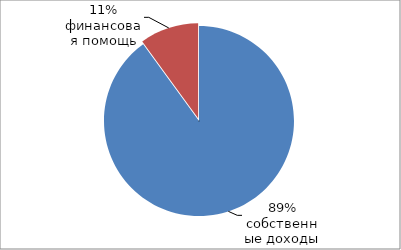
| Category | Series 0 |
|---|---|
| 0 | 0.9 |
| 1 | 0.1 |